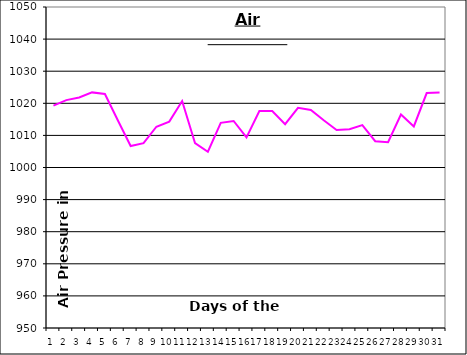
| Category | Series 0 |
|---|---|
| 0 | 1019.3 |
| 1 | 1021 |
| 2 | 1021.8 |
| 3 | 1023.4 |
| 4 | 1022.9 |
| 5 | 1014.7 |
| 6 | 1006.7 |
| 7 | 1007.6 |
| 8 | 1012.7 |
| 9 | 1014.3 |
| 10 | 1020.7 |
| 11 | 1007.6 |
| 12 | 1004.9 |
| 13 | 1013.9 |
| 14 | 1014.5 |
| 15 | 1009.4 |
| 16 | 1017.6 |
| 17 | 1017.6 |
| 18 | 1013.5 |
| 19 | 1018.6 |
| 20 | 1017.9 |
| 21 | 1014.7 |
| 22 | 1011.7 |
| 23 | 1011.9 |
| 24 | 1013.2 |
| 25 | 1008.2 |
| 26 | 1007.9 |
| 27 | 1016.5 |
| 28 | 1012.8 |
| 29 | 1023.2 |
| 30 | 1023.4 |